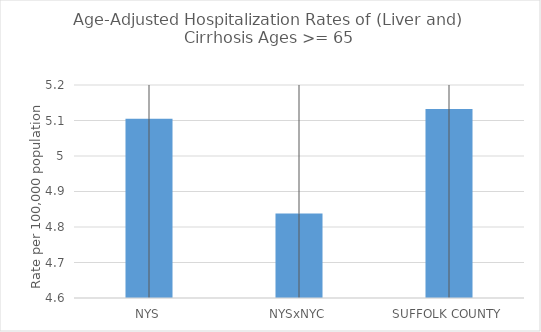
| Category | Age-Adjusted Hospitalization Rates of (Liver and) Cirrhosis Ages >= 65 |
|---|---|
| NYS | 5.105 |
| NYSxNYC | 4.838 |
| SUFFOLK COUNTY | 5.132 |